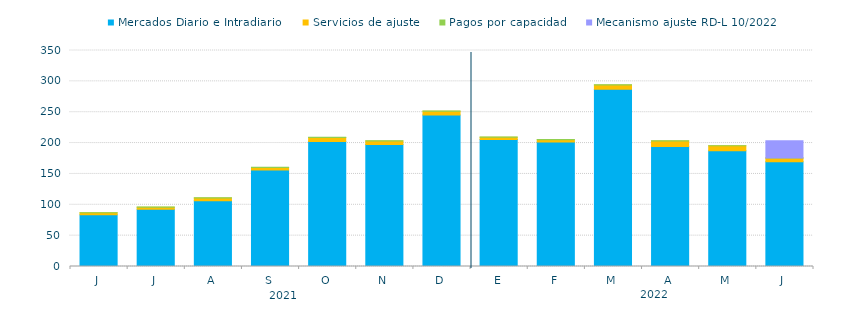
| Category | Mercados Diario e Intradiario  | Servicios de ajuste | Pagos por capacidad | Mecanismo ajuste RD-L 10/2022 |
|---|---|---|---|---|
| J | 83.91 | 3.01 | 0.31 | 0 |
| J | 92.77 | 3.09 | 0.55 | 0 |
| A | 106.41 | 4.64 | 0.31 | 0 |
| S | 156.53 | 3.92 | 0.31 | 0 |
| O | 202.39 | 6.69 | 0.26 | 0 |
| N | 197.49 | 5.92 | 0.38 | 0 |
| D | 245.63 | 5.94 | 0.55 | 0 |
| E | 205.75 | 3.78 | 0.43 | 0 |
| F | 201.85 | 3.39 | 0.46 | 0 |
| M | 287.12 | 6.89 | 0.32 | 0 |
| A | 194.26 | 9.06 | 0.24 | 0 |
| M | 187.74 | 7.84 | 0.23 | 0 |
| J | 169.75 | 6 | 0.25 | 27.64 |